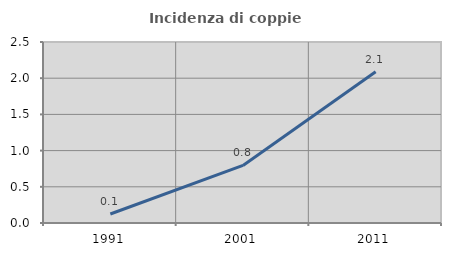
| Category | Incidenza di coppie miste |
|---|---|
| 1991.0 | 0.125 |
| 2001.0 | 0.795 |
| 2011.0 | 2.09 |